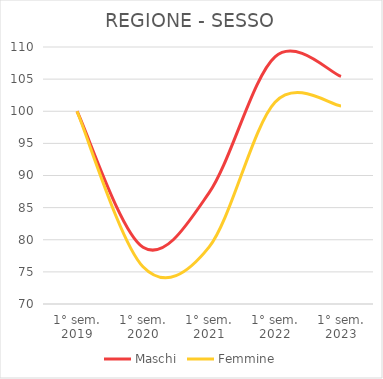
| Category | Maschi | Femmine |
|---|---|---|
| 1° sem.
2019 | 100 | 100 |
| 1° sem.
2020 | 78.836 | 75.801 |
| 1° sem.
2021 | 87.291 | 78.847 |
| 1° sem.
2022 | 108.481 | 101.401 |
| 1° sem.
2023 | 105.423 | 100.835 |